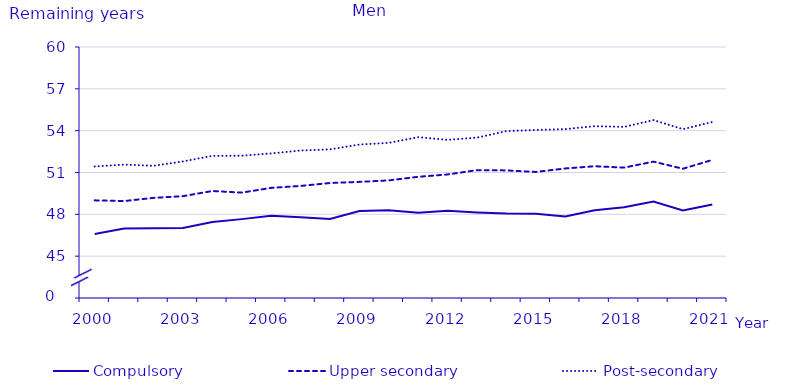
| Category | Compulsory | Upper secondary | Post-secondary |
|---|---|---|---|
| 2000.0 | 46.586 | 49.003 | 51.43 |
| 2001.0 | 46.977 | 48.953 | 51.567 |
| 2002.0 | 46.995 | 49.18 | 51.479 |
| 2003.0 | 47.018 | 49.302 | 51.794 |
| 2004.0 | 47.454 | 49.674 | 52.195 |
| 2005.0 | 47.656 | 49.557 | 52.202 |
| 2006.0 | 47.893 | 49.898 | 52.369 |
| 2007.0 | 47.79 | 50.037 | 52.577 |
| 2008.0 | 47.664 | 50.246 | 52.658 |
| 2009.0 | 48.231 | 50.328 | 53.005 |
| 2010.0 | 48.297 | 50.433 | 53.127 |
| 2011.0 | 48.107 | 50.692 | 53.534 |
| 2012.0 | 48.25 | 50.86 | 53.34 |
| 2013.0 | 48.14 | 51.17 | 53.5 |
| 2014.0 | 48.06 | 51.15 | 53.97 |
| 2015.0 | 48.05 | 51.04 | 54.05 |
| 2016.0 | 47.84 | 51.29 | 54.11 |
| 2017.0 | 48.3 | 51.45 | 54.32 |
| 2018.0 | 48.51 | 51.35 | 54.27 |
| 2019.0 | 48.92 | 51.78 | 54.76 |
| 2020.0 | 48.28 | 51.27 | 54.11 |
| 2021.0 | 48.71 | 51.9 | 54.62 |